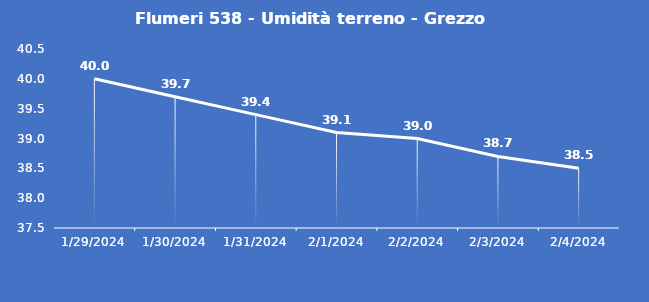
| Category | Flumeri 538 - Umidità terreno - Grezzo (%VWC) |
|---|---|
| 1/29/24 | 40 |
| 1/30/24 | 39.7 |
| 1/31/24 | 39.4 |
| 2/1/24 | 39.1 |
| 2/2/24 | 39 |
| 2/3/24 | 38.7 |
| 2/4/24 | 38.5 |